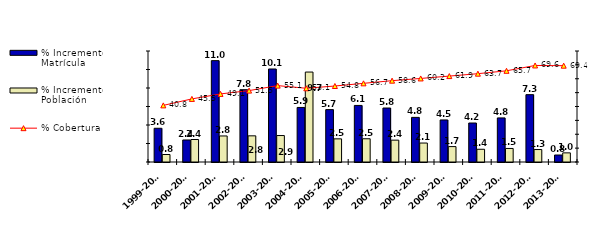
| Category | % Incremento Matrícula | % Incremento Población |
|---|---|---|
| 2005-2006 | 5.662 | 2.502 |
| 2006-2007 | 6.116 | 2.512 |
| 2007-2008 | 5.835 | 2.362 |
| 2008-2009 | 4.823 | 2.05 |
| 2009-2010 | 4.545 | 1.666 |
| 2010-2011 | 4.215 | 1.376 |
| 2011-2012 | 4.765 | 1.464 |
| 2012-2013 | 7.279 | 1.347 |
| 2013-2014 | 0.756 | 0.987 |